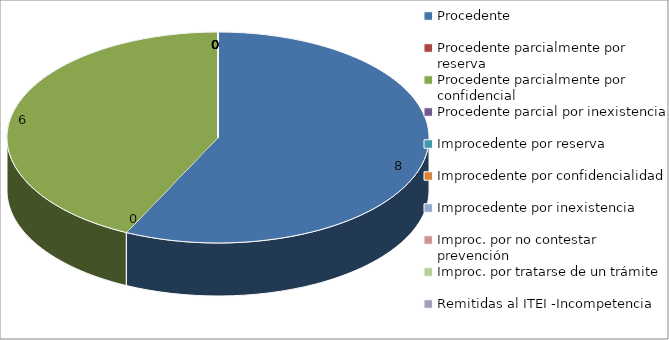
| Category | Series 0 |
|---|---|
| Procedente | 8 |
| Procedente parcialmente por reserva  | 0 |
| Procedente parcialmente por confidencial | 6 |
| Procedente parcial por inexistencia | 0 |
| Improcedente por reserva  | 0 |
| Improcedente por confidencialidad | 0 |
| Improcedente por inexistencia  | 0 |
| Improc. por no contestar prevención | 0 |
| Improc. por tratarse de un trámite  | 0 |
| Remitidas al ITEI -Incompetencia  | 0 |